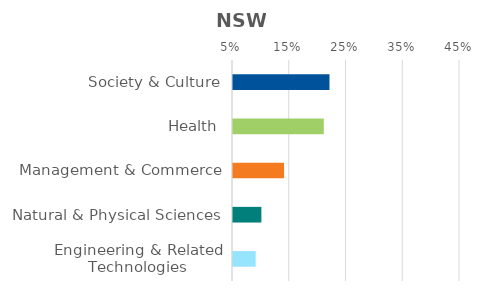
| Category | Series 0 |
|---|---|
| Society & Culture | 0.22 |
| Health | 0.21 |
| Management & Commerce | 0.14 |
| Natural & Physical Sciences | 0.1 |
| Engineering & Related Technologies | 0.09 |